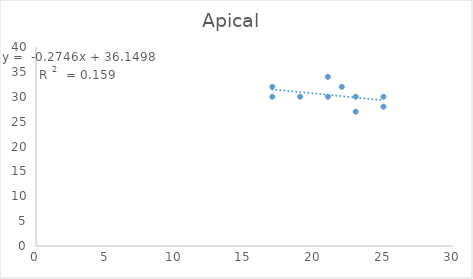
| Category | Apical  |
|---|---|
| 17.0 | 30 |
| 17.0 | 32 |
| 23.0 | 27 |
| 23.0 | 30 |
| 21.0 | 34 |
| 21.0 | 30 |
| 19.0 | 30 |
| 22.0 | 32 |
| 25.0 | 28 |
| 25.0 | 30 |